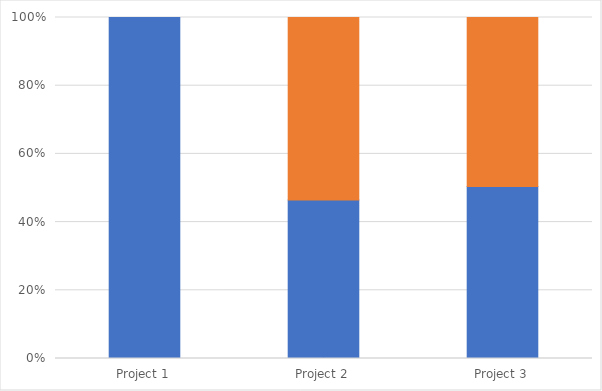
| Category | Projects |
|---|---|
| Project 1 | 0 |
| Project 2 | 0.535 |
| Project 3 | 0.495 |